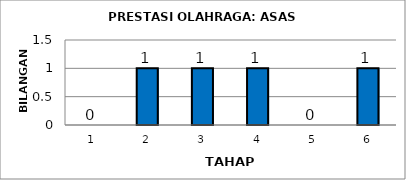
| Category | Series 0 |
|---|---|
| 1.0 | 0 |
| 2.0 | 1 |
| 3.0 | 1 |
| 4.0 | 1 |
| 5.0 | 0 |
| 6.0 | 1 |